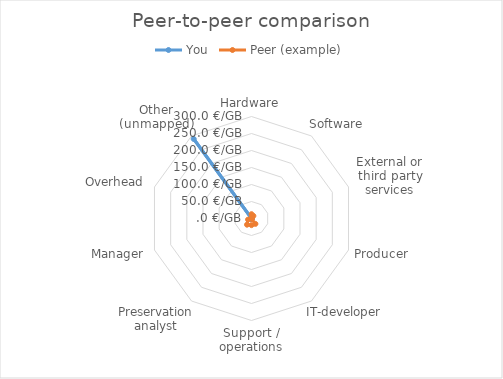
| Category | You | Peer (example) |
|---|---|---|
| Hardware | 0.195 | 12.7 |
| Software | 1.953 | 9.42 |
| External or third party services | 0 | 0 |
| Producer | 0 | 0 |
| IT-developer | 0.137 | 19.53 |
| Support / operations | 0.059 | 19.53 |
| Preservation analyst | 0.977 | 22.46 |
| Manager | 0 | 10.74 |
| Overhead | 0 | 0 |
| Other (unmapped) | 289.258 | 0 |